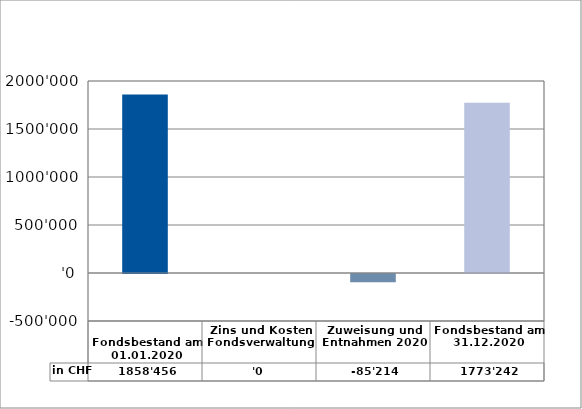
| Category | in CHF |
|---|---|
| 
Fondsbestand am 01.01.2020

 | 1858456 |
| Zins und Kosten Fondsverwaltung | 0 |
| Zuweisung und Entnahmen 2020 | -85214.4 |
| Fondsbestand am 31.12.2020 | 1773241.6 |